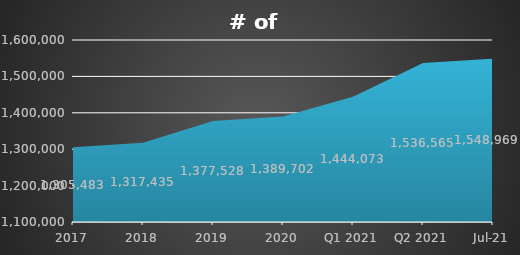
| Category | # of producers* |
|---|---|
| 2017 | 1305483 |
| 2018 | 1317435 |
| 2019 | 1377528 |
| 2020 | 1389702 |
| Q1 2021 | 1444073 |
| Q2 2021 | 1536565 |
| Jul-21 | 1548969 |